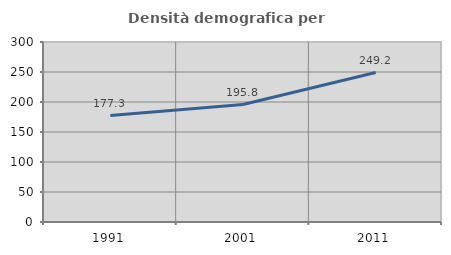
| Category | Densità demografica |
|---|---|
| 1991.0 | 177.342 |
| 2001.0 | 195.792 |
| 2011.0 | 249.157 |